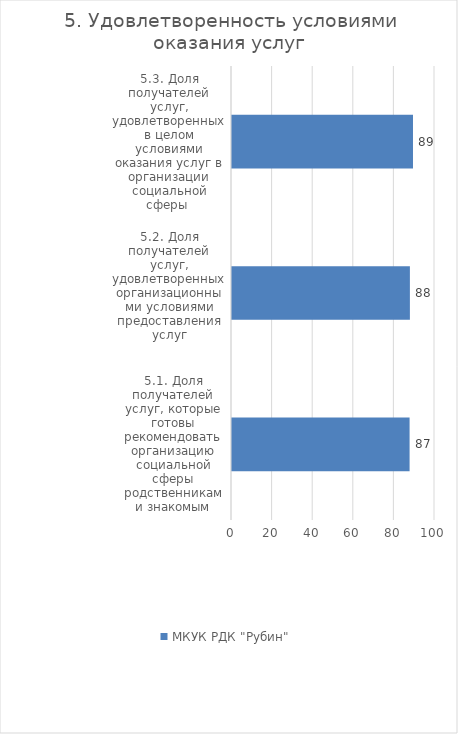
| Category | МКУК РДК "Рубин"  |
|---|---|
| 5.1. Доля получателей услуг, которые готовы рекомендовать организацию социальной сферы родственникам и знакомым | 87.481 |
| 5.2. Доля получателей услуг, удовлетворенных организационными условиями предоставления услуг | 87.634 |
| 5.3. Доля получателей услуг, удовлетворенных в целом условиями оказания услуг в организации социальной сферы  | 89.16 |